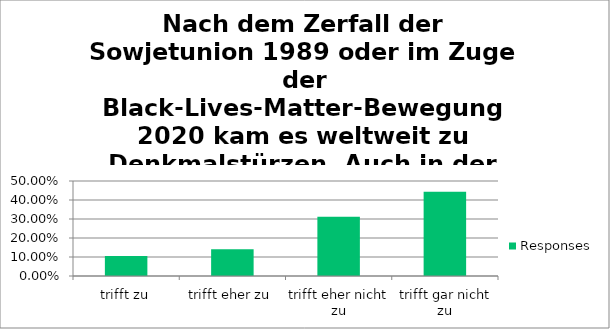
| Category | Responses |
|---|---|
| trifft zu | 0.105 |
| trifft eher zu | 0.14 |
| trifft eher nicht zu | 0.311 |
| trifft gar nicht zu | 0.443 |